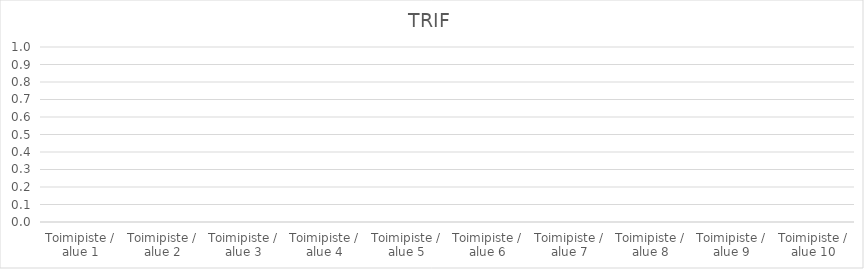
| Category | TRIF |
|---|---|
| Toimipiste / alue 1 | 0 |
| Toimipiste / alue 2 | 0 |
| Toimipiste / alue 3 | 0 |
| Toimipiste / alue 4 | 0 |
| Toimipiste / alue 5 | 0 |
| Toimipiste / alue 6 | 0 |
| Toimipiste / alue 7 | 0 |
| Toimipiste / alue 8 | 0 |
| Toimipiste / alue 9 | 0 |
| Toimipiste / alue 10 | 0 |